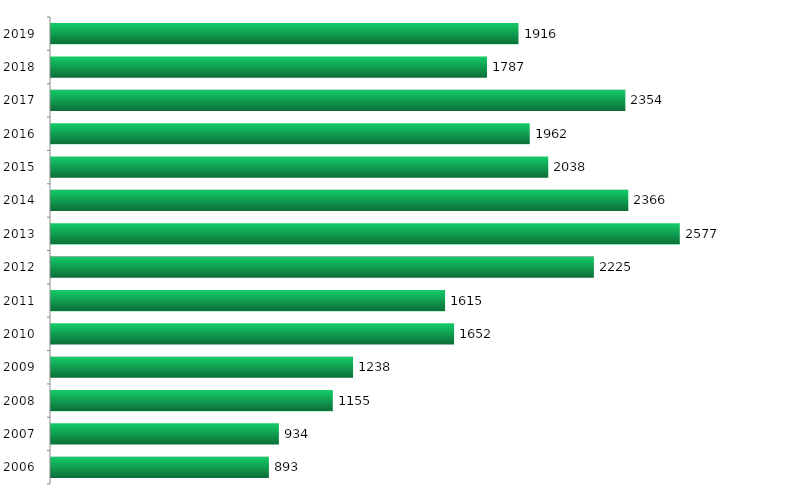
| Category | Ingressantes |
|---|---|
| 2006.0 | 893 |
| 2007.0 | 934 |
| 2008.0 | 1155 |
| 2009.0 | 1238 |
| 2010.0 | 1652 |
| 2011.0 | 1615 |
| 2012.0 | 2225 |
| 2013.0 | 2577 |
| 2014.0 | 2366 |
| 2015.0 | 2038 |
| 2016.0 | 1962 |
| 2017.0 | 2354 |
| 2018.0 | 1787 |
| 2019.0 | 1916 |